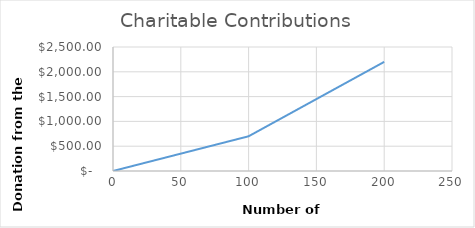
| Category | Series 0 |
|---|---|
| 0.0 | 0 |
| 2.0 | 14 |
| 4.0 | 28 |
| 6.0 | 42 |
| 8.0 | 56 |
| 10.0 | 70 |
| 12.0 | 84 |
| 14.0 | 98 |
| 16.0 | 112 |
| 18.0 | 126 |
| 20.0 | 140 |
| 22.0 | 154 |
| 24.0 | 168 |
| 26.0 | 182 |
| 28.0 | 196 |
| 30.0 | 210 |
| 32.0 | 224 |
| 34.0 | 238 |
| 36.0 | 252 |
| 38.0 | 266 |
| 40.0 | 280 |
| 42.0 | 294 |
| 44.0 | 308 |
| 46.0 | 322 |
| 48.0 | 336 |
| 50.0 | 350 |
| 52.0 | 364 |
| 54.0 | 378 |
| 56.0 | 392 |
| 58.0 | 406 |
| 60.0 | 420 |
| 62.0 | 434 |
| 64.0 | 448 |
| 66.0 | 462 |
| 68.0 | 476 |
| 70.0 | 490 |
| 72.0 | 504 |
| 74.0 | 518 |
| 76.0 | 532 |
| 78.0 | 546 |
| 80.0 | 560 |
| 82.0 | 574 |
| 84.0 | 588 |
| 86.0 | 602 |
| 88.0 | 616 |
| 90.0 | 630 |
| 92.0 | 644 |
| 94.0 | 658 |
| 96.0 | 672 |
| 98.0 | 686 |
| 100.0 | 700 |
| 102.0 | 730 |
| 104.0 | 760 |
| 106.0 | 790 |
| 108.0 | 820 |
| 110.0 | 850 |
| 112.0 | 880 |
| 114.0 | 910 |
| 116.0 | 940 |
| 118.0 | 970 |
| 120.0 | 1000 |
| 122.0 | 1030 |
| 124.0 | 1060 |
| 126.0 | 1090 |
| 128.0 | 1120 |
| 130.0 | 1150 |
| 132.0 | 1180 |
| 134.0 | 1210 |
| 136.0 | 1240 |
| 138.0 | 1270 |
| 140.0 | 1300 |
| 142.0 | 1330 |
| 144.0 | 1360 |
| 146.0 | 1390 |
| 148.0 | 1420 |
| 150.0 | 1450 |
| 152.0 | 1480 |
| 154.0 | 1510 |
| 156.0 | 1540 |
| 158.0 | 1570 |
| 160.0 | 1600 |
| 162.0 | 1630 |
| 164.0 | 1660 |
| 166.0 | 1690 |
| 168.0 | 1720 |
| 170.0 | 1750 |
| 172.0 | 1780 |
| 174.0 | 1810 |
| 176.0 | 1840 |
| 178.0 | 1870 |
| 180.0 | 1900 |
| 182.0 | 1930 |
| 184.0 | 1960 |
| 186.0 | 1990 |
| 188.0 | 2020 |
| 190.0 | 2050 |
| 192.0 | 2080 |
| 194.0 | 2110 |
| 196.0 | 2140 |
| 198.0 | 2170 |
| 200.0 | 2200 |